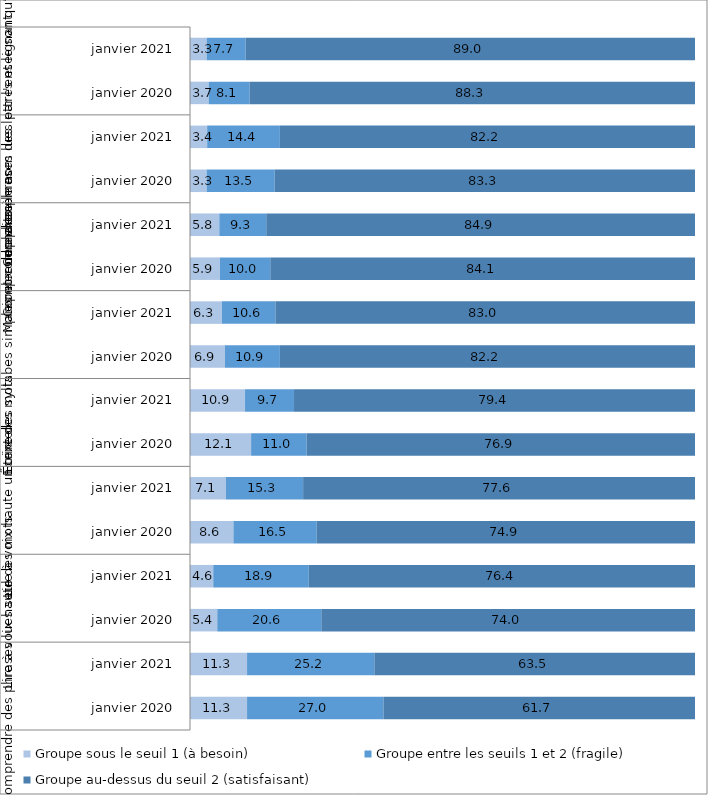
| Category | Groupe sous le seuil 1 (à besoin) | Groupe entre les seuils 1 et 2 (fragile) | Groupe au-dessus du seuil 2 (satisfaisant) |
|---|---|---|---|
| 0 | 11.3 | 27 | 61.7 |
| 1 | 11.3 | 25.2 | 63.5 |
| 2 | 5.4 | 20.6 | 74 |
| 3 | 4.6 | 18.9 | 76.4 |
| 4 | 8.6 | 16.5 | 74.9 |
| 5 | 7.1 | 15.3 | 77.6 |
| 6 | 12.1 | 11 | 76.9 |
| 7 | 10.9 | 9.7 | 79.4 |
| 8 | 6.9 | 10.9 | 82.2 |
| 9 | 6.3 | 10.6 | 83 |
| 10 | 5.9 | 10 | 84.1 |
| 11 | 5.8 | 9.3 | 84.9 |
| 12 | 3.3 | 13.5 | 83.3 |
| 13 | 3.4 | 14.4 | 82.2 |
| 14 | 3.7 | 8.1 | 88.3 |
| 15 | 3.3 | 7.7 | 89 |